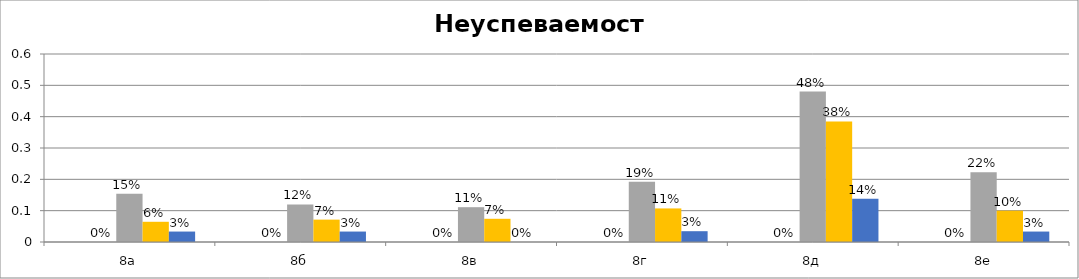
| Category | Series 0 | Series 1 | Series 2 | Series 3 | Series 4 |
|---|---|---|---|---|---|
| 8а |  | 0 | 0.154 | 0.065 | 0.033 |
| 8б |  | 0 | 0.12 | 0.071 | 0.033 |
| 8в |  | 0 | 0.111 | 0.074 | 0 |
| 8г |  | 0 | 0.192 | 0.107 | 0.034 |
| 8д |  | 0 | 0.48 | 0.385 | 0.138 |
| 8е |  | 0 | 0.222 | 0.1 | 0.033 |